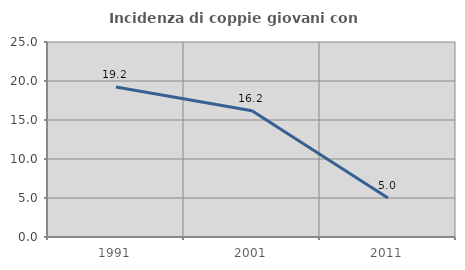
| Category | Incidenza di coppie giovani con figli |
|---|---|
| 1991.0 | 19.231 |
| 2001.0 | 16.176 |
| 2011.0 | 5 |